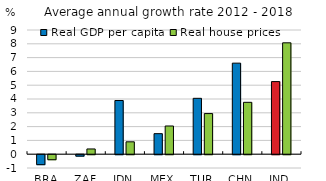
| Category | Real GDP per capita | Real house prices |
|---|---|---|
| BRA | -0.723 | -0.366 |
| ZAF | -0.104 | 0.379 |
| IDN | 3.891 | 0.897 |
| MEX | 1.488 | 2.044 |
| TUR | 4.049 | 2.944 |
| CHN | 6.598 | 3.76 |
| IND | 5.262 | 8.071 |